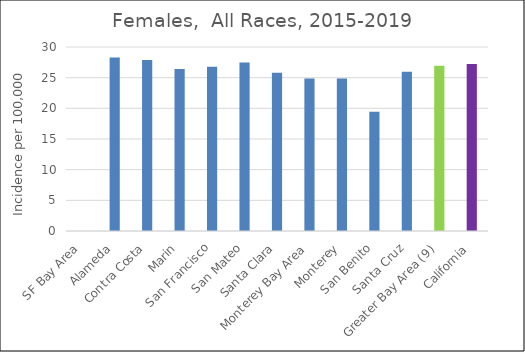
| Category | Female |
|---|---|
| SF Bay Area | 0 |
|   Alameda | 28.29 |
|   Contra Costa | 27.87 |
|   Marin | 26.4 |
|   San Francisco | 26.78 |
|   San Mateo | 27.49 |
|   Santa Clara | 25.82 |
| Monterey Bay Area | 24.85 |
|   Monterey | 24.87 |
|   San Benito | 19.43 |
|   Santa Cruz | 25.96 |
| Greater Bay Area (9) | 26.96 |
| California | 27.22 |